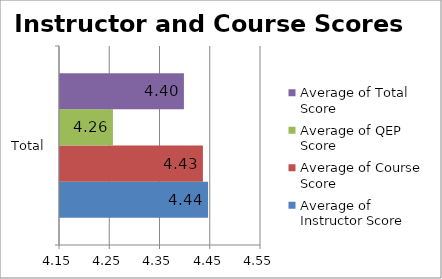
| Category | Average of Instructor Score | Average of Course Score | Average of QEP Score | Average of Total Score |
|---|---|---|---|---|
| Total | 4.445 | 4.434 | 4.255 | 4.397 |